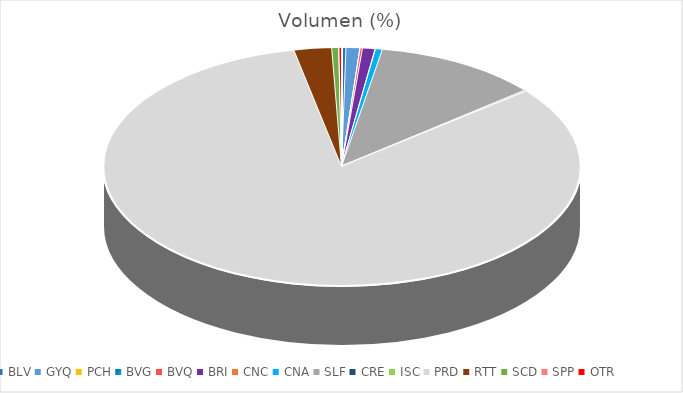
| Category | Volumen (%) |
|---|---|
| BLV | 49950 |
| GYQ | 156784.31 |
| PCH | 1738 |
| BVG | 1370.4 |
| BVQ | 25615.48 |
| BRI | 142000 |
| CNC | 4058.8 |
| CNA | 78838 |
| SLF | 1878586.06 |
| CRE | 23272.75 |
| ISC | 431.2 |
| PRD | 13828204.75 |
| RTT | 427205.72 |
| SCD | 78264.55 |
| SPP | 2890 |
| OTR | 29282.8 |